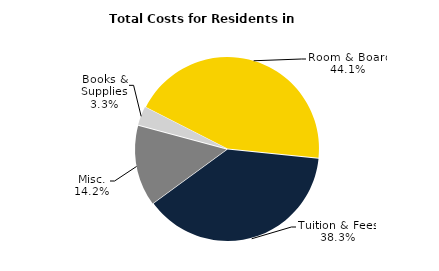
| Category | Series 0 |
|---|---|
| Room & Board | 0.441 |
| Tuition & Fees | 0.383 |
| Misc. | 0.142 |
| Books & Supplies | 0.033 |